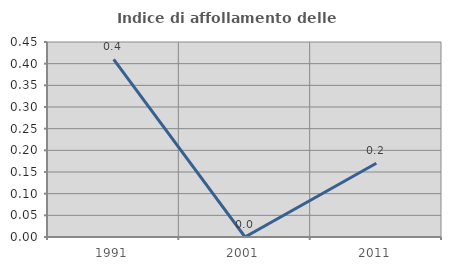
| Category | Indice di affollamento delle abitazioni  |
|---|---|
| 1991.0 | 0.41 |
| 2001.0 | 0 |
| 2011.0 | 0.17 |